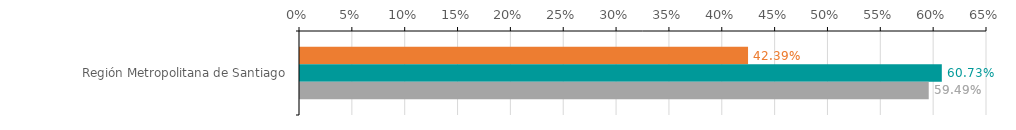
| Category | Numero de operaciones | Monto ($ MM) | Garantia ($ MM) |
|---|---|---|---|
| Región Metropolitana de Santiago | 0.424 | 0.607 | 0.595 |